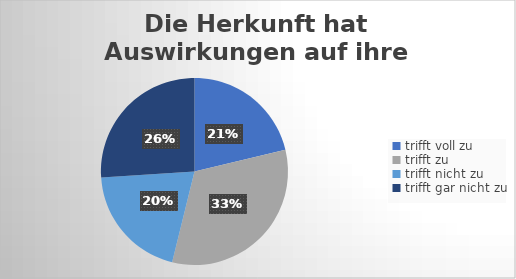
| Category | Die Herkunft hat Auswirkungen auf ihre Chancen |
|---|---|
| trifft voll zu | 58 |
| trifft zu  | 89 |
| trifft nicht zu  | 55 |
| trifft gar nicht zu | 71 |